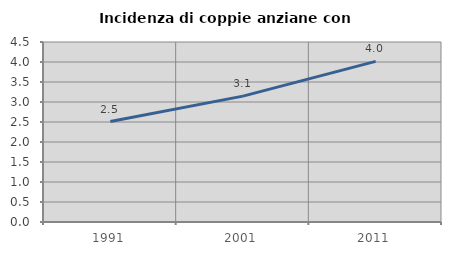
| Category | Incidenza di coppie anziane con figli |
|---|---|
| 1991.0 | 2.51 |
| 2001.0 | 3.148 |
| 2011.0 | 4.016 |